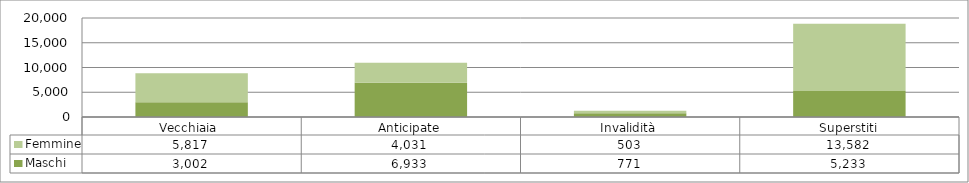
| Category | Maschi | Femmine |
|---|---|---|
| Vecchiaia  | 3002 | 5817 |
| Anticipate | 6933 | 4031 |
| Invalidità | 771 | 503 |
| Superstiti | 5233 | 13582 |